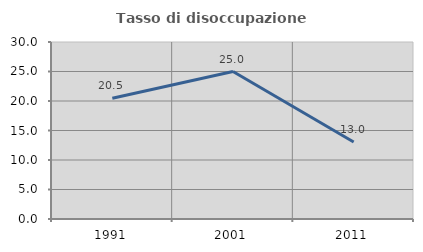
| Category | Tasso di disoccupazione giovanile  |
|---|---|
| 1991.0 | 20.455 |
| 2001.0 | 25 |
| 2011.0 | 13.043 |